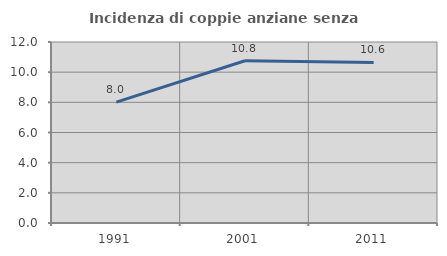
| Category | Incidenza di coppie anziane senza figli  |
|---|---|
| 1991.0 | 8.01 |
| 2001.0 | 10.76 |
| 2011.0 | 10.644 |